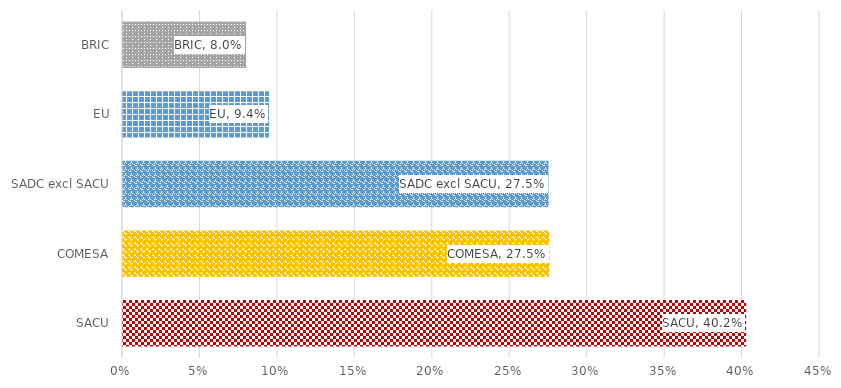
| Category | %Share |
|---|---|
| SACU | 0.402 |
| COMESA | 0.275 |
| SADC excl SACU | 0.275 |
| EU | 0.094 |
| BRIC | 0.08 |